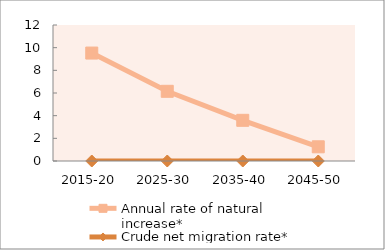
| Category | Annual rate of natural increase* | Crude net migration rate* |
|---|---|---|
| 2015-20 | 9.524 | 0 |
| 2025-30 | 6.15 | 0 |
| 2035-40 | 3.589 | 0 |
| 2045-50 | 1.253 | 0 |